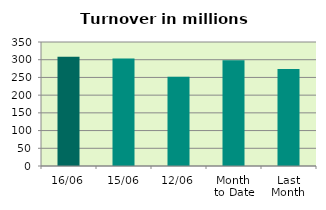
| Category | Series 0 |
|---|---|
| 16/06 | 308.546 |
| 15/06 | 303.586 |
| 12/06 | 252.204 |
| Month 
to Date | 298.227 |
| Last
Month | 273.813 |